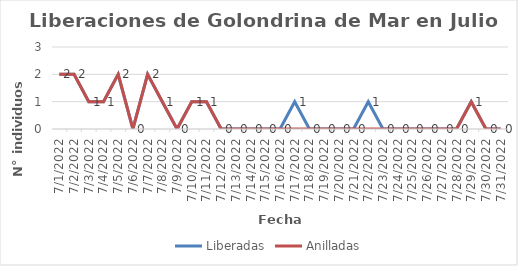
| Category | Liberadas | Anilladas |
|---|---|---|
| 7/1/22 | 2 | 2 |
| 7/2/22 | 2 | 2 |
| 7/3/22 | 1 | 1 |
| 7/4/22 | 1 | 1 |
| 7/5/22 | 2 | 2 |
| 7/6/22 | 0 | 0 |
| 7/7/22 | 2 | 2 |
| 7/8/22 | 1 | 1 |
| 7/9/22 | 0 | 0 |
| 7/10/22 | 1 | 1 |
| 7/11/22 | 1 | 1 |
| 7/12/22 | 0 | 0 |
| 7/13/22 | 0 | 0 |
| 7/14/22 | 0 | 0 |
| 7/15/22 | 0 | 0 |
| 7/16/22 | 0 | 0 |
| 7/17/22 | 1 | 0 |
| 7/18/22 | 0 | 0 |
| 7/19/22 | 0 | 0 |
| 7/20/22 | 0 | 0 |
| 7/21/22 | 0 | 0 |
| 7/22/22 | 1 | 0 |
| 7/23/22 | 0 | 0 |
| 7/24/22 | 0 | 0 |
| 7/25/22 | 0 | 0 |
| 7/26/22 | 0 | 0 |
| 7/27/22 | 0 | 0 |
| 7/28/22 | 0 | 0 |
| 7/29/22 | 1 | 1 |
| 7/30/22 | 0 | 0 |
| 7/31/22 | 0 | 0 |